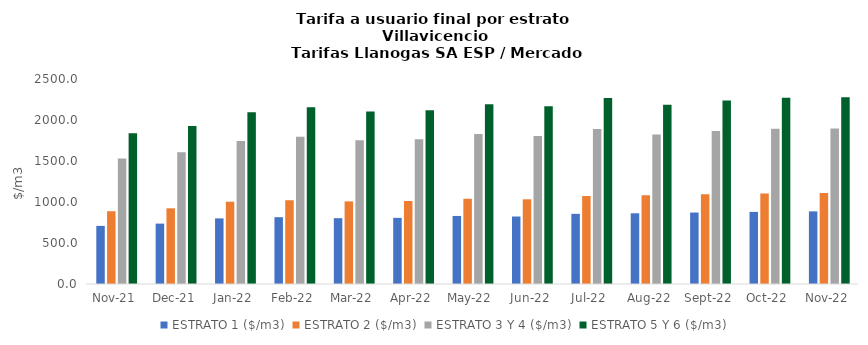
| Category | ESTRATO 1 ($/m3) | ESTRATO 2 ($/m3) | ESTRATO 3 Y 4 ($/m3) | ESTRATO 5 Y 6 ($/m3) |
|---|---|---|---|---|
| 2021-11-01 | 708.48 | 887.6 | 1531.38 | 1837.656 |
| 2021-12-01 | 736.43 | 923.08 | 1606.27 | 1927.524 |
| 2022-01-01 | 800.06 | 1003.53 | 1745.17 | 2094.204 |
| 2022-02-01 | 814.71 | 1021.7 | 1795.42 | 2154.504 |
| 2022-03-01 | 802.54 | 1007.66 | 1753.7 | 2104.44 |
| 2022-04-01 | 806.47 | 1012.6 | 1765.16 | 2118.192 |
| 2022-05-01 | 829.82 | 1041.02 | 1827.98 | 2193.576 |
| 2022-06-01 | 823.08 | 1033.17 | 1805.61 | 2166.732 |
| 2022-07-01 | 855.48 | 1073.26 | 1889.9 | 2267.88 |
| 2022-08-01 | 862.41 | 1081.96 | 1822.3 | 2186.76 |
| 2022-09-01 | 871.27 | 1093.08 | 1865.58 | 2238.696 |
| 2022-10-01 | 879.42 | 1103.3 | 1892.31 | 2270.772 |
| 2022-11-01 | 885.71 | 1111.19 | 1896.63 | 2275.956 |